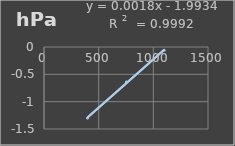
| Category | Presión Admosferica |
|---|---|
| 397.9 | -1.3 |
| 753.2 | -0.641 |
| 1099.3 | -0.06 |